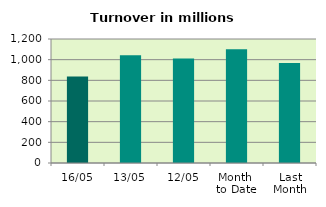
| Category | Series 0 |
|---|---|
| 16/05 | 838.071 |
| 13/05 | 1042.291 |
| 12/05 | 1010.255 |
| Month 
to Date | 1101.932 |
| Last
Month | 968.247 |